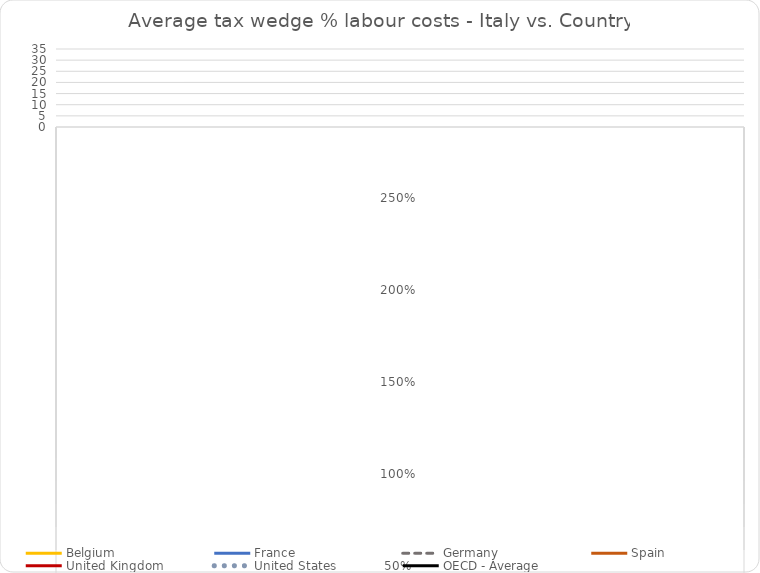
| Category | Belgium | France | Germany | Spain | United Kingdom | United States | OECD - Average |
|---|---|---|---|---|---|---|---|
| 0 | 1 | 1 | 1 | 1 | 1 | 1 | 1 |